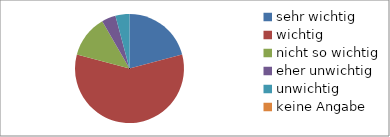
| Category | Series 0 |
|---|---|
| sehr wichtig | 5 |
| wichtig | 14 |
| nicht so wichtig | 3 |
| eher unwichtig | 1 |
| unwichtig | 1 |
| keine Angabe | 0 |